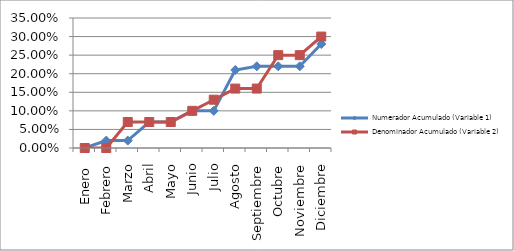
| Category | Numerador Acumulado (Variable 1) | Denominador Acumulado (Variable 2) |
|---|---|---|
| Enero  | 0 | 0 |
| Febrero | 0.02 | 0 |
| Marzo | 0.02 | 0.07 |
| Abril | 0.07 | 0.07 |
| Mayo | 0.07 | 0.07 |
| Junio | 0.1 | 0.1 |
| Julio | 0.1 | 0.13 |
| Agosto | 0.21 | 0.16 |
| Septiembre | 0.22 | 0.16 |
| Octubre | 0.22 | 0.25 |
| Noviembre | 0.22 | 0.25 |
| Diciembre | 0.28 | 0.3 |